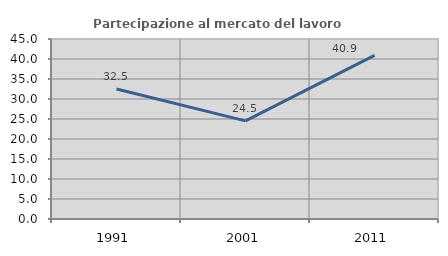
| Category | Partecipazione al mercato del lavoro  femminile |
|---|---|
| 1991.0 | 32.481 |
| 2001.0 | 24.538 |
| 2011.0 | 40.896 |